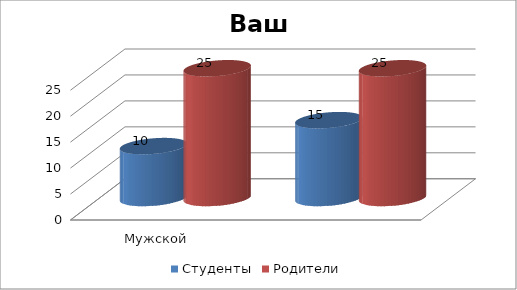
| Category | Студенты | Родители |
|---|---|---|
| Мужской | 10 | 25 |